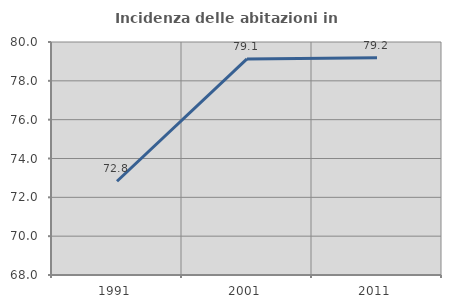
| Category | Incidenza delle abitazioni in proprietà  |
|---|---|
| 1991.0 | 72.827 |
| 2001.0 | 79.129 |
| 2011.0 | 79.186 |